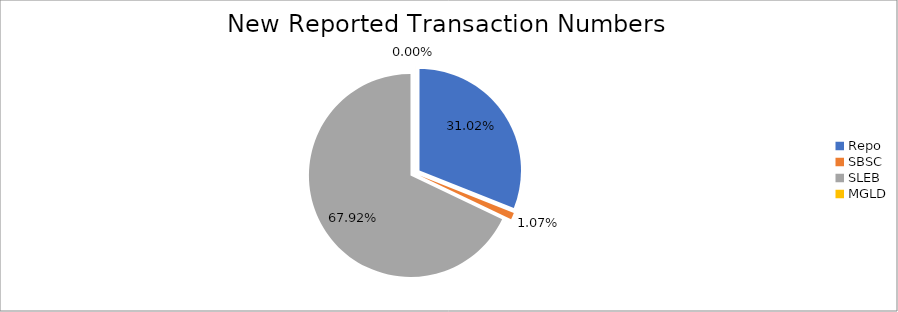
| Category | Series 0 |
|---|---|
| Repo | 313343 |
| SBSC | 10767 |
| SLEB | 686154 |
| MGLD | 15 |